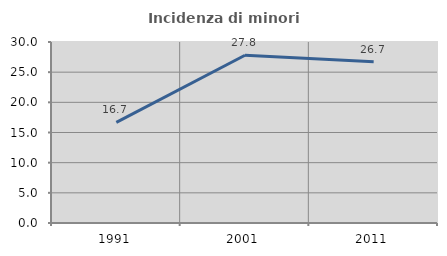
| Category | Incidenza di minori stranieri |
|---|---|
| 1991.0 | 16.667 |
| 2001.0 | 27.811 |
| 2011.0 | 26.718 |